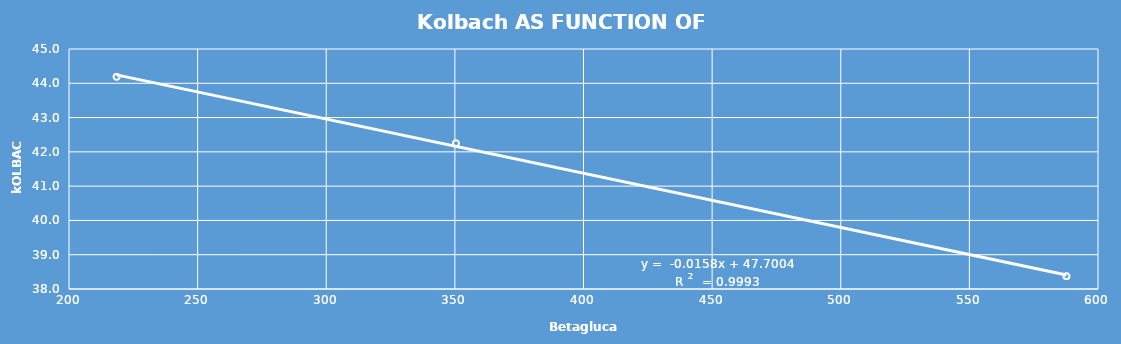
| Category | Series 0 |
|---|---|
| 587.75 | 38.375 |
| 350.4375 | 42.25 |
| 218.5 | 44.188 |